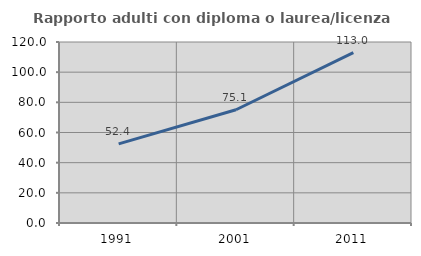
| Category | Rapporto adulti con diploma o laurea/licenza media  |
|---|---|
| 1991.0 | 52.448 |
| 2001.0 | 75.086 |
| 2011.0 | 112.989 |